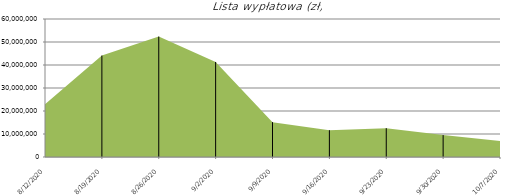
| Category | Lista wypłatowa (zł) |
|---|---|
| 8/12/20 | 22961896.11 |
| 8/19/20 | 44101784.7 |
| 8/26/20 | 52355975.79 |
| 9/2/20 | 41313676.66 |
| 9/9/20 | 15162233.48 |
| 9/16/20 | 11660042.1 |
| 9/23/20 | 12531023.18 |
| 9/30/20 | 9514160.35 |
| 10/7/20 | 6917961.06 |